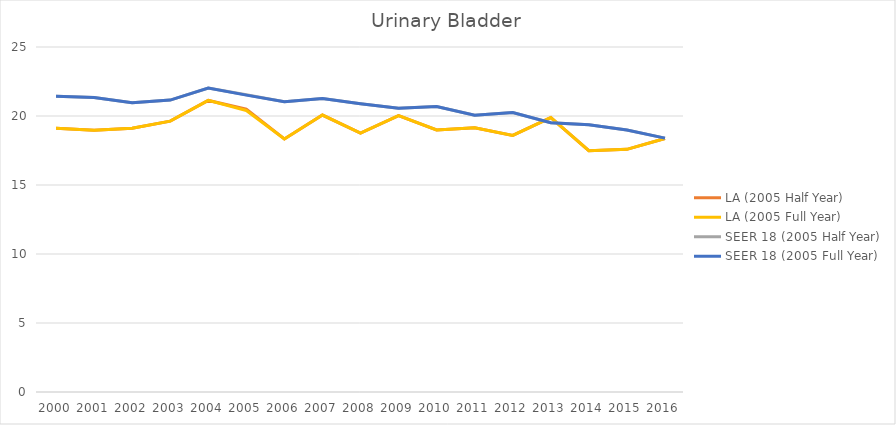
| Category | LA (2005 Half Year) | LA (2005 Full Year) | SEER 18 (2005 Half Year) | SEER 18 (2005 Full Year) |
|---|---|---|---|---|
| 2000.0 | 19.112 | 19.112 | 21.438 | 21.438 |
| 2001.0 | 18.969 | 18.969 | 21.335 | 21.335 |
| 2002.0 | 19.107 | 19.107 | 20.956 | 20.956 |
| 2003.0 | 19.628 | 19.628 | 21.155 | 21.155 |
| 2004.0 | 21.129 | 21.129 | 22.024 | 22.024 |
| 2005.0 | 20.491 | 20.402 | 21.547 | 21.513 |
| 2006.0 | 18.338 | 18.338 | 21.036 | 21.036 |
| 2007.0 | 20.068 | 20.068 | 21.271 | 21.271 |
| 2008.0 | 18.762 | 18.762 | 20.885 | 20.885 |
| 2009.0 | 20.035 | 20.035 | 20.561 | 20.561 |
| 2010.0 | 18.991 | 18.991 | 20.685 | 20.685 |
| 2011.0 | 19.14 | 19.14 | 20.056 | 20.056 |
| 2012.0 | 18.59 | 18.59 | 20.247 | 20.247 |
| 2013.0 | 19.882 | 19.882 | 19.513 | 19.513 |
| 2014.0 | 17.488 | 17.488 | 19.373 | 19.373 |
| 2015.0 | 17.584 | 17.584 | 18.99 | 18.99 |
| 2016.0 | 18.367 | 18.367 | 18.394 | 18.394 |